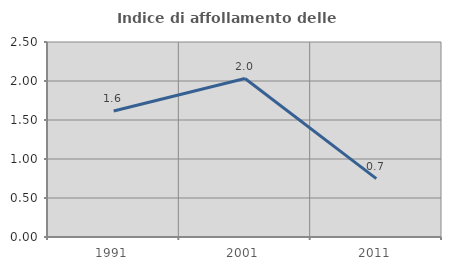
| Category | Indice di affollamento delle abitazioni  |
|---|---|
| 1991.0 | 1.615 |
| 2001.0 | 2.032 |
| 2011.0 | 0.749 |